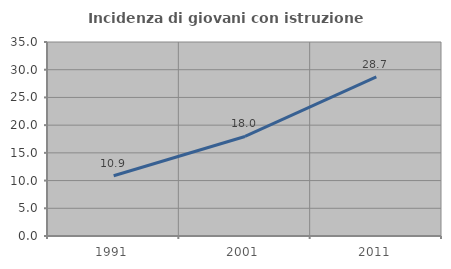
| Category | Incidenza di giovani con istruzione universitaria |
|---|---|
| 1991.0 | 10.867 |
| 2001.0 | 17.954 |
| 2011.0 | 28.71 |